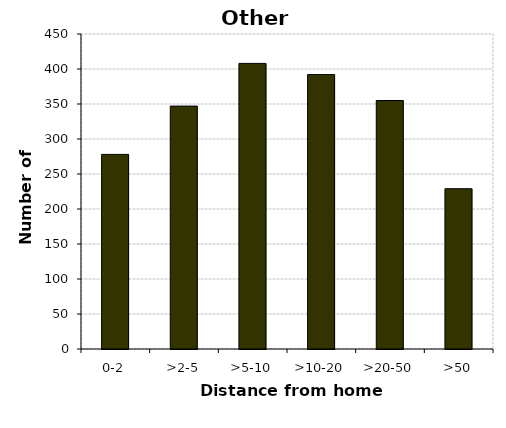
| Category | Other vehicles |
|---|---|
| 0-2 | 278 |
| >2-5 | 347 |
| >5-10 | 408 |
| >10-20 | 392 |
| >20-50 | 355 |
| >50 | 229 |